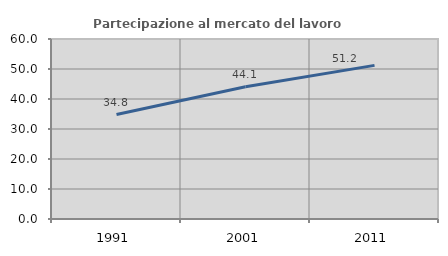
| Category | Partecipazione al mercato del lavoro  femminile |
|---|---|
| 1991.0 | 34.814 |
| 2001.0 | 44.082 |
| 2011.0 | 51.211 |